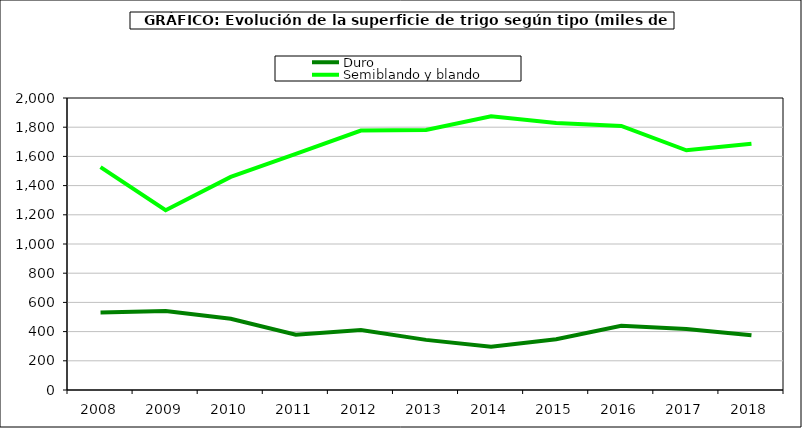
| Category | Duro | Semiblando y blando |
|---|---|---|
| 2008 | 531.661 | 1526.209 |
| 2009 | 541.581 | 1231.171 |
| 2010 | 488.306 | 1459.767 |
| 2011 | 378.054 | 1616.599 |
| 2012 | 411.053 | 1777.118 |
| 2013 | 343.389 | 1781.58 |
| 2014 | 297.13 | 1874.542 |
| 2015 | 347.93 | 1828.423 |
| 2016 | 440.16 | 1808.688 |
| 2017 | 417.589 | 1641.635 |
| 2018 | 374.608 | 1686.9 |